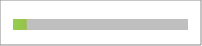
| Category | Series 0 |
|---|---|
| 0 | -0.322 |